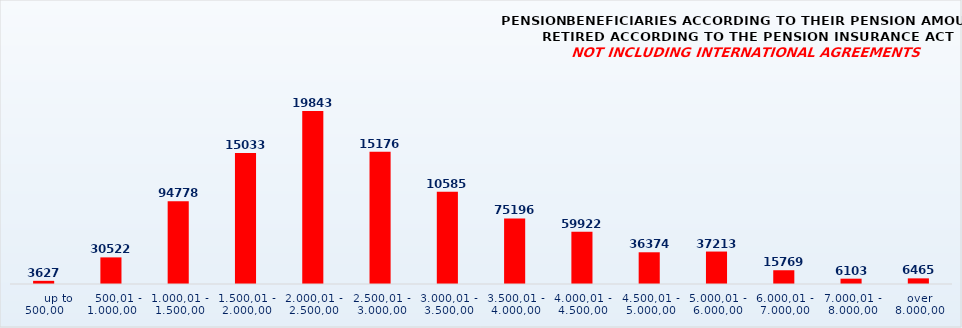
| Category | PENSION BENEFICIARIES ACCORDING TO TYPES AND AMOUNTS OF PENSION, RETIRED ACCORDING TO THE PENSION INSURANCE ACT
NOT INCLUDING INTERNATIONAL AGREEMENTS |
|---|---|
|       up to 500,00 | 3627 |
|    500,01 - 1.000,00 | 30522 |
| 1.000,01 - 1.500,00 | 94778 |
| 1.500,01 - 2.000,00 | 150334 |
| 2.000,01 - 2.500,00 | 198432 |
| 2.500,01 - 3.000,00 | 151768 |
| 3.000,01 - 3.500,00 | 105858 |
| 3.500,01 - 4.000,00 | 75196 |
| 4.000,01 - 4.500,00 | 59922 |
| 4.500,01 - 5.000,00 | 36374 |
| 5.000,01 - 6.000,00 | 37213 |
| 6.000,01 - 7.000,00 | 15769 |
| 7.000,01 - 8.000,00 | 6103 |
|  over  8.000,00 | 6465 |